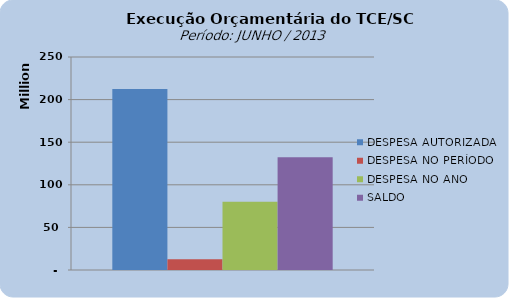
| Category | DESPESA AUTORIZADA | DESPESA NO PERÍODO | DESPESA NO ANO | SALDO |
|---|---|---|---|---|
| 0 | 212339585.97 | 12552613.43 | 80089204.01 | 132250381.96 |